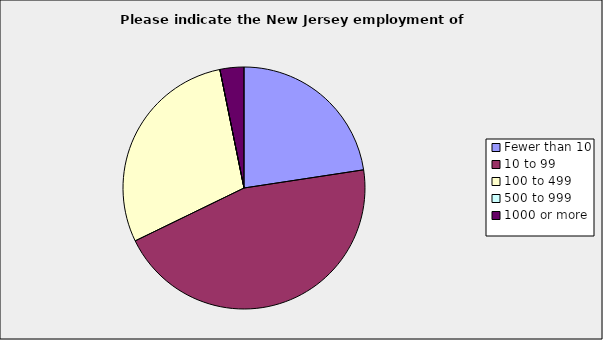
| Category | Series 0 |
|---|---|
| Fewer than 10 | 0.226 |
| 10 to 99 | 0.452 |
| 100 to 499 | 0.29 |
| 500 to 999 | 0 |
| 1000 or more | 0.032 |